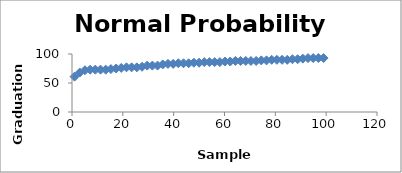
| Category | Series 0 |
|---|---|
| 1.0204081632653061 | 61 |
| 3.0612244897959187 | 68 |
| 5.1020408163265305 | 72 |
| 7.142857142857143 | 73 |
| 9.183673469387756 | 73 |
| 11.224489795918368 | 73 |
| 13.265306122448981 | 73 |
| 15.306122448979593 | 74 |
| 17.346938775510203 | 75 |
| 19.387755102040817 | 76 |
| 21.428571428571427 | 77 |
| 23.46938775510204 | 77 |
| 25.510204081632654 | 77 |
| 27.551020408163264 | 78 |
| 29.591836734693878 | 80 |
| 31.632653061224488 | 80 |
| 33.673469387755105 | 80 |
| 35.714285714285715 | 82 |
| 37.75510204081633 | 83 |
| 39.79591836734694 | 83 |
| 41.83673469387755 | 84 |
| 43.87755102040817 | 84 |
| 45.91836734693878 | 84 |
| 47.95918367346939 | 85 |
| 50.00000000000001 | 85 |
| 52.04081632653062 | 86 |
| 54.08163265306123 | 86 |
| 56.12244897959184 | 86 |
| 58.163265306122454 | 86 |
| 60.204081632653065 | 87 |
| 62.244897959183675 | 87 |
| 64.28571428571429 | 88 |
| 66.3265306122449 | 88 |
| 68.36734693877551 | 88 |
| 70.40816326530611 | 88 |
| 72.44897959183673 | 88 |
| 74.48979591836735 | 89 |
| 76.53061224489795 | 89 |
| 78.57142857142857 | 90 |
| 80.61224489795919 | 90 |
| 82.65306122448979 | 90 |
| 84.6938775510204 | 90 |
| 86.73469387755102 | 91 |
| 88.77551020408163 | 91 |
| 90.81632653061224 | 92 |
| 92.85714285714286 | 93 |
| 94.89795918367346 | 93 |
| 96.93877551020408 | 93 |
| 98.9795918367347 | 93 |